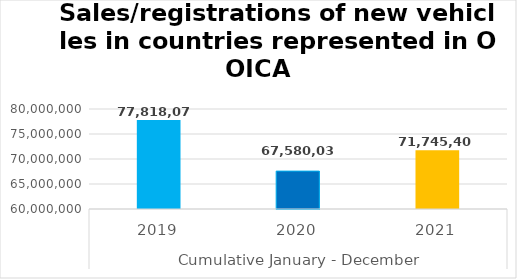
| Category | Series 0 |
|---|---|
| 0 | 77818073.725 |
| 1 | 67580029.716 |
| 2 | 71745408 |